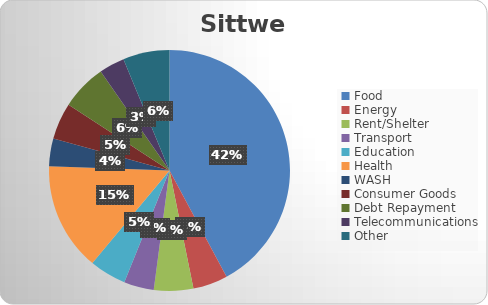
| Category | Series 0 |
|---|---|
| Food  | 135751.791 |
| Energy | 15024.823 |
| Rent/Shelter | 17004.727 |
| Transport | 12959.22 |
| Education | 15891.876 |
| Health | 46773.05 |
| WASH | 11882.979 |
| Consumer Goods | 15867.021 |
| Debt Repayment | 19769.504 |
| Telecommunications | 11058.156 |
| Other  | 20088.652 |